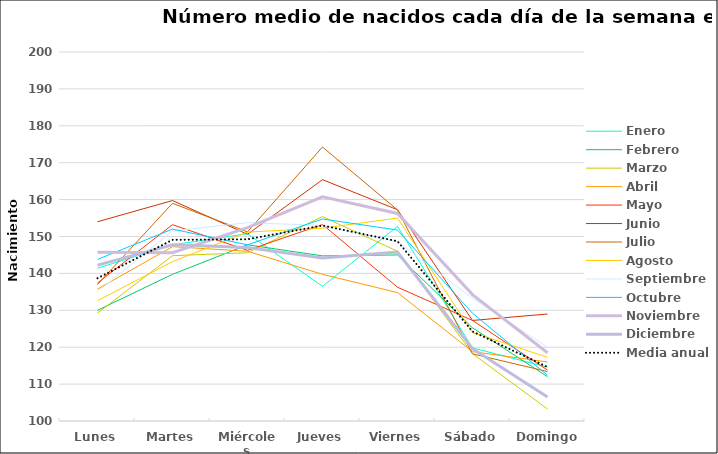
| Category | Enero | Febrero | Marzo | Abril | Mayo | Junio | Julio | Agosto | Septiembre | Octubre | Noviembre | Diciembre | Media anual |
|---|---|---|---|---|---|---|---|---|---|---|---|---|---|
| Lunes | 141.4 | 130 | 129.25 | 135.75 | 137.4 | 154 | 137 | 132.6 | 135 | 143.8 | 145.75 | 142.25 | 138.692 |
| Martes | 147.75 | 139.75 | 144.8 | 147.25 | 153.2 | 159.75 | 159 | 143.2 | 151.5 | 152 | 145.6 | 147.75 | 149.096 |
| Miércoles | 150.75 | 147.75 | 145.6 | 146 | 146.25 | 150.6 | 151.25 | 151.2 | 153.75 | 147.75 | 152.4 | 147 | 149.25 |
| Jueves | 136.5 | 144.75 | 155.4 | 139.75 | 153.25 | 165.4 | 174.25 | 152.25 | 153 | 154.75 | 160.75 | 144.2 | 152.981 |
| Viernes | 152.75 | 145 | 146 | 134.8 | 136.25 | 157.25 | 157.2 | 155 | 148.6 | 151.75 | 156.25 | 145.8 | 148.712 |
| Sábado | 119.8 | 125.25 | 118.25 | 118.8 | 127.25 | 127.25 | 118.2 | 124 | 133.25 | 129.2 | 134.25 | 119.6 | 124.264 |
| Domingo | 114.6 | 112 | 103.25 | 116 | 113.8 | 129 | 113.4 | 117.25 | 120 | 112.4 | 118.5 | 106.5 | 114.635 |